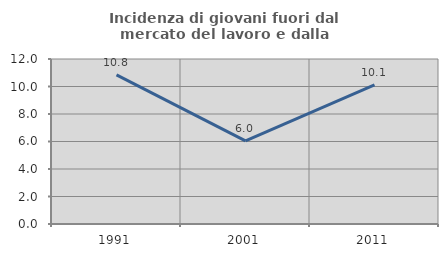
| Category | Incidenza di giovani fuori dal mercato del lavoro e dalla formazione  |
|---|---|
| 1991.0 | 10.849 |
| 2001.0 | 6.044 |
| 2011.0 | 10.127 |